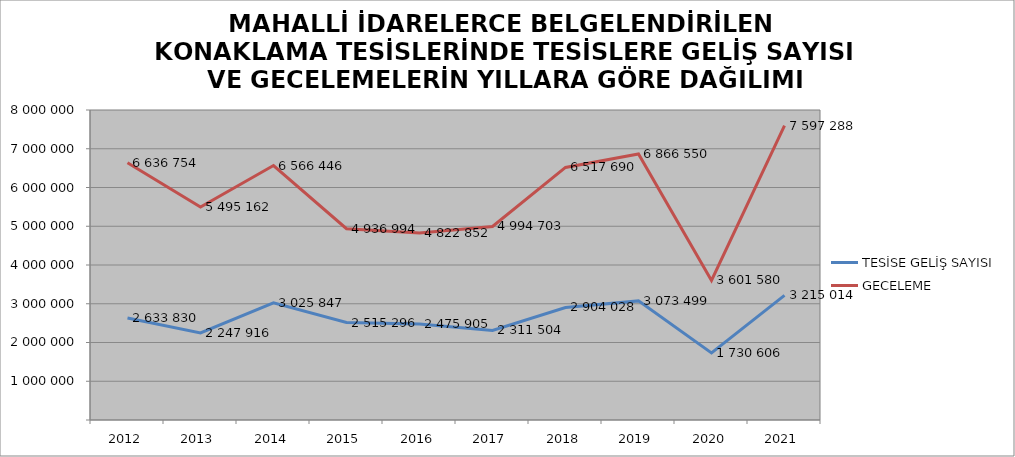
| Category | TESİSE GELİŞ SAYISI | GECELEME |
|---|---|---|
| 2012 | 2633830 | 6636754 |
| 2013 | 2247916 | 5495162 |
| 2014 | 3025847 | 6566446 |
| 2015 | 2515296 | 4936994 |
| 2016 | 2475905 | 4822852 |
| 2017 | 2311504 | 4994703 |
| 2018 | 2904028 | 6517690 |
| 2019 | 3073499 | 6866550 |
| 2020 | 1730606 | 3601580 |
| 2021 | 3215014 | 7597288 |